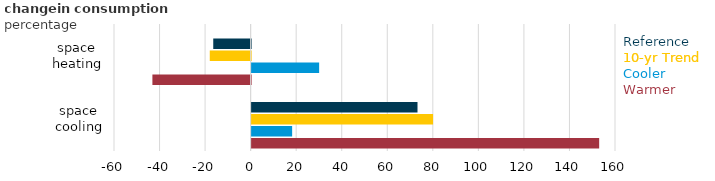
| Category | Warmer | Cooler | 10-yr Trend | Reference | Series 4 |
|---|---|---|---|---|---|
| space cooling | 152.609 | 17.786 | 79.676 | 72.833 |  |
| space heating | -43.136 | 29.643 | -17.947 | -16.417 |  |